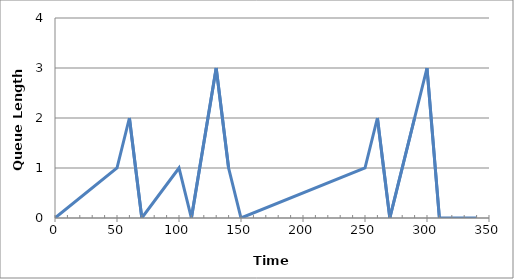
| Category | Series 0 |
|---|---|
| 0.0 | 0 |
| 50.0 | 1 |
| 60.0 | 2 |
| 70.0 | 0 |
| 100.0 | 1 |
| 110.0 | 0 |
| 130.0 | 3 |
| 140.0 | 1 |
| 150.0 | 0 |
| 250.0 | 1 |
| 260.0 | 2 |
| 270.0 | 0 |
| 290.0 | 2 |
| 300.0 | 3 |
| 310.0 | 0 |
| 340.0 | 0 |